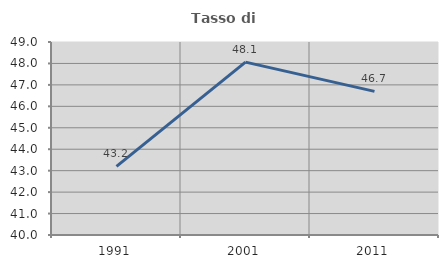
| Category | Tasso di occupazione   |
|---|---|
| 1991.0 | 43.198 |
| 2001.0 | 48.061 |
| 2011.0 | 46.697 |